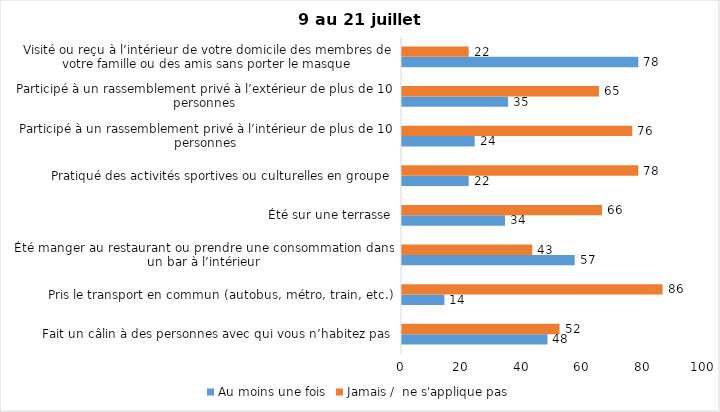
| Category | Au moins une fois | Jamais /  ne s'applique pas |
|---|---|---|
| Fait un câlin à des personnes avec qui vous n’habitez pas | 48 | 52 |
| Pris le transport en commun (autobus, métro, train, etc.) | 14 | 86 |
| Été manger au restaurant ou prendre une consommation dans un bar à l’intérieur | 57 | 43 |
| Été sur une terrasse | 34 | 66 |
| Pratiqué des activités sportives ou culturelles en groupe | 22 | 78 |
| Participé à un rassemblement privé à l’intérieur de plus de 10 personnes | 24 | 76 |
| Participé à un rassemblement privé à l’extérieur de plus de 10 personnes | 35 | 65 |
| Visité ou reçu à l’intérieur de votre domicile des membres de votre famille ou des amis sans porter le masque | 78 | 22 |